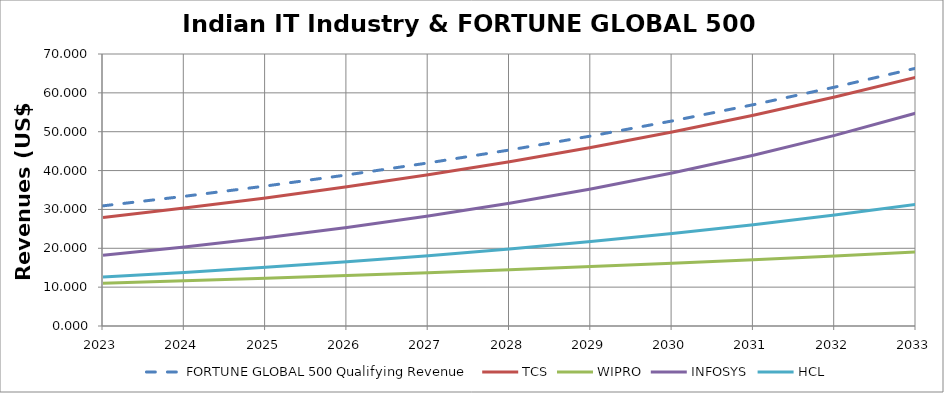
| Category | FORTUNE GLOBAL 500 Qualifying Revenue | TCS | WIPRO | INFOSYS | HCL |
|---|---|---|---|---|---|
| 2023.0 | 30.922 | 27.93 | 11.011 | 18.21 | 12.58 |
| 2024.0 | 33.375 | 30.345 | 11.63 | 20.33 | 13.779 |
| 2025.0 | 36.023 | 32.969 | 12.284 | 22.697 | 15.093 |
| 2026.0 | 38.881 | 35.82 | 12.974 | 25.339 | 16.532 |
| 2027.0 | 41.966 | 38.918 | 13.703 | 28.29 | 18.108 |
| 2028.0 | 45.296 | 42.283 | 14.474 | 31.583 | 19.835 |
| 2029.0 | 48.89 | 45.94 | 15.287 | 35.26 | 21.726 |
| 2030.0 | 52.768 | 49.912 | 16.147 | 39.365 | 23.797 |
| 2031.0 | 56.955 | 54.228 | 17.054 | 43.949 | 26.066 |
| 2032.0 | 61.474 | 58.918 | 18.013 | 49.065 | 28.551 |
| 2033.0 | 66.351 | 64.013 | 19.025 | 54.778 | 31.274 |